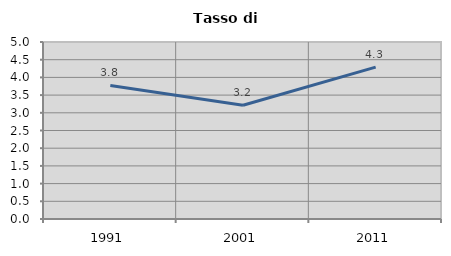
| Category | Tasso di disoccupazione   |
|---|---|
| 1991.0 | 3.774 |
| 2001.0 | 3.214 |
| 2011.0 | 4.29 |